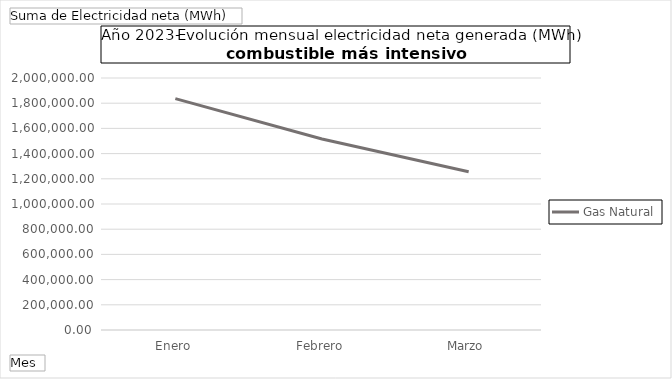
| Category | Gas Natural |
|---|---|
| Enero | 1836661.42 |
| Febrero | 1515724.14 |
| Marzo | 1255435.403 |